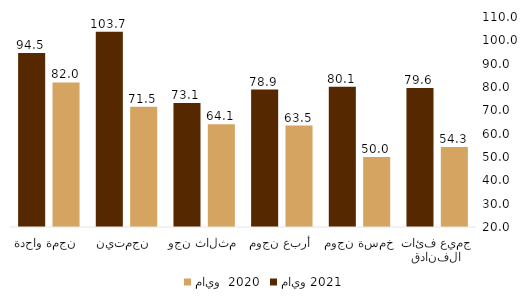
| Category | مايو  2020 | مايو 2021 |
|---|---|---|
| جميع فئات الفنادق | 54.269 | 79.585 |
|  خمسة نجوم  | 49.968 | 80.144 |
| أربع نجوم | 63.476 | 78.895 |
| ثلاث نجوم  | 64.059 | 73.146 |
| نجمتين  | 71.524 | 103.674 |
| نجمة واحدة  | 81.956 | 94.537 |